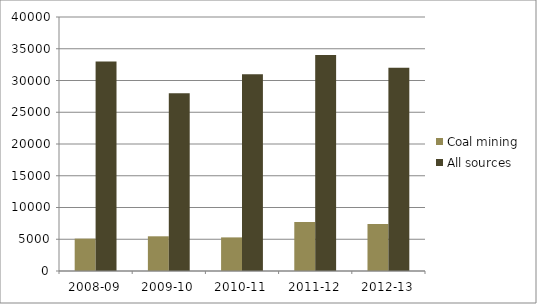
| Category | Coal mining | All sources |
|---|---|---|
| _x0007_2008-09 | 5100 | 33000 |
| _x0007_2009-10 | 5465.434 | 28000 |
| _x0007_2010-11 | 5292.775 | 31000 |
| _x0007_2011-12 | 7700.489 | 34000 |
| _x0007_2012-13 | 7385.25 | 32000 |